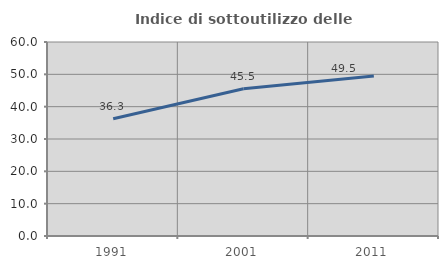
| Category | Indice di sottoutilizzo delle abitazioni  |
|---|---|
| 1991.0 | 36.284 |
| 2001.0 | 45.519 |
| 2011.0 | 49.499 |